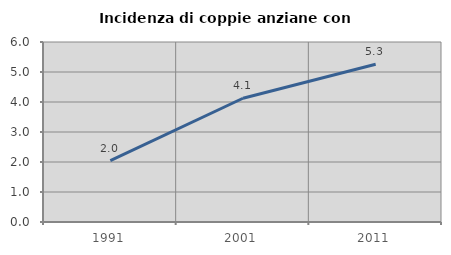
| Category | Incidenza di coppie anziane con figli |
|---|---|
| 1991.0 | 2.043 |
| 2001.0 | 4.125 |
| 2011.0 | 5.259 |